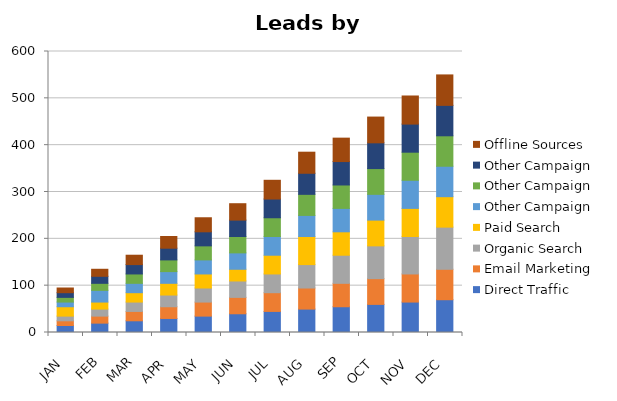
| Category | Direct Traffic | Email Marketing | Organic Search | Paid Search | Other Campaign  | Other Campaign | Offline Sources |
|---|---|---|---|---|---|---|---|
| JAN | 15 | 10 | 10 | 20 | 10 | 10 | 10 |
| FEB | 20 | 15 | 15 | 15 | 25 | 15 | 15 |
| MAR | 25 | 20 | 20 | 20 | 20 | 20 | 20 |
| APR | 30 | 25 | 25 | 25 | 25 | 25 | 25 |
| MAY | 35 | 30 | 30 | 30 | 30 | 30 | 30 |
| JUN | 40 | 35 | 35 | 25 | 35 | 35 | 35 |
| JUL | 45 | 40 | 40 | 40 | 40 | 40 | 40 |
| AUG | 50 | 45 | 50 | 60 | 45 | 45 | 45 |
| SEP | 55 | 50 | 60 | 50 | 50 | 50 | 50 |
| OCT | 60 | 55 | 70 | 55 | 55 | 55 | 55 |
| NOV | 65 | 60 | 80 | 60 | 60 | 60 | 60 |
| DEC | 70 | 65 | 90 | 65 | 65 | 65 | 65 |